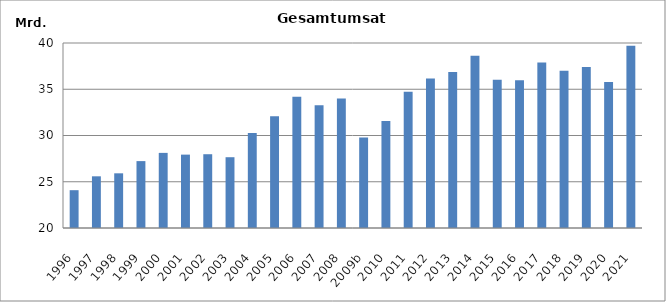
| Category | Series 0 |
|---|---|
| 1996 | 24088396 |
| 1997 | 25588482 |
| 1998 | 25911875 |
| 1999 | 27231996 |
| 2000 | 28121089 |
| 2001 | 27932719 |
| 2002 | 27976228 |
| 2003 | 27652647 |
| 2004 | 30278000 |
| 2005 | 32080721 |
| 2006 | 34189922 |
| 2007 | 33278221 |
| 2008 | 33993013 |
| 2009b | 29783049 |
| 2010 | 31557474.731 |
| 2011 | 34741088 |
| 2012 | 36149532 |
| 2013 | 36865320 |
| 2014 | 38623232.674 |
| 2015 | 36018872 |
| 2016 | 35975244 |
| 2017 | 37901736 |
| 2018 | 36997819 |
| 2019 | 37418803 |
| 2020 | 35788469 |
| 2021 | 39715028.881 |